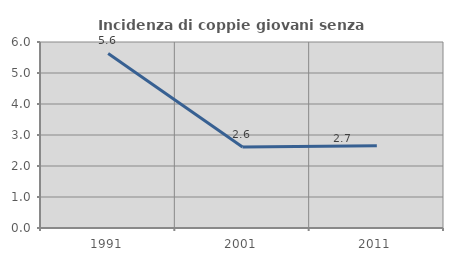
| Category | Incidenza di coppie giovani senza figli |
|---|---|
| 1991.0 | 5.631 |
| 2001.0 | 2.612 |
| 2011.0 | 2.655 |